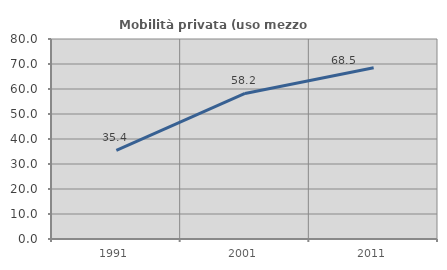
| Category | Mobilità privata (uso mezzo privato) |
|---|---|
| 1991.0 | 35.418 |
| 2001.0 | 58.229 |
| 2011.0 | 68.495 |